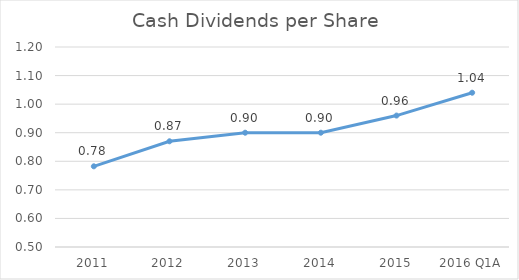
| Category | Series 0 |
|---|---|
| 2011 | 0.782 |
| 2012 | 0.87 |
| 2013 | 0.9 |
| 2014 | 0.9 |
| 2015 | 0.96 |
| 2016 Q1A | 1.04 |